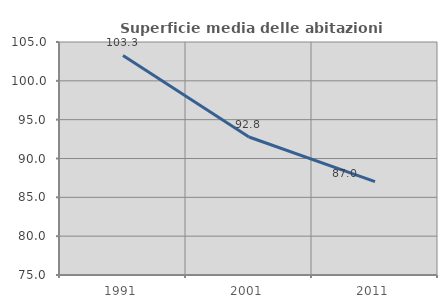
| Category | Superficie media delle abitazioni occupate |
|---|---|
| 1991.0 | 103.273 |
| 2001.0 | 92.764 |
| 2011.0 | 87.023 |